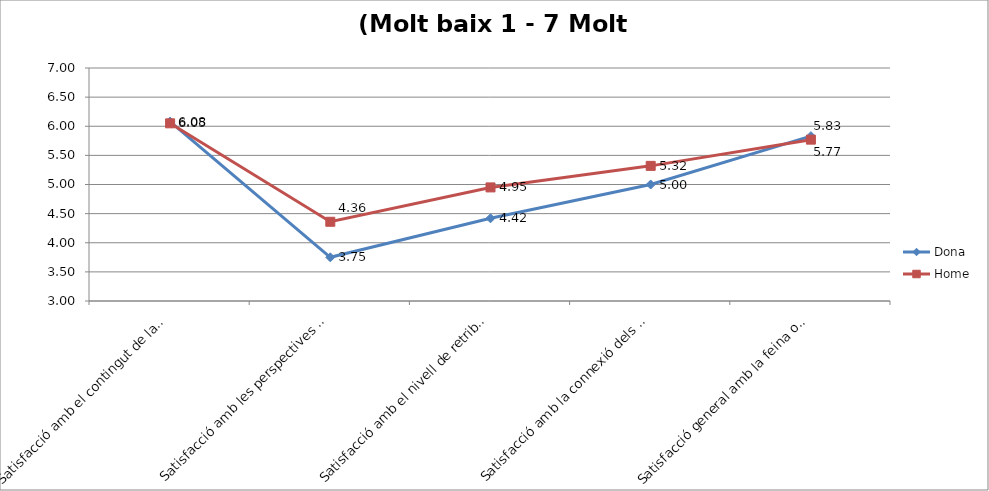
| Category | Dona | Home |
|---|---|---|
| Satisfacció amb el contingut de la feina | 6.08 | 6.05 |
| Satisfacció amb les perspectives de millora i promoció | 3.75 | 4.36 |
| Satisfacció amb el nivell de retribució | 4.42 | 4.95 |
| Satisfacció amb la connexió dels coneixements/competències desenvolupades de la formació doctoral i la feina | 5 | 5.32 |
| Satisfacció general amb la feina on treballes | 5.83 | 5.77 |